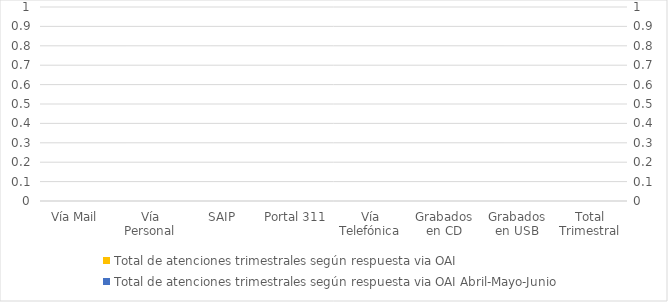
| Category | Total de atenciones trimestrales según respuesta via OAI | Series 2 | Series 4 |
|---|---|---|---|
| Vía Mail | 0 |  |  |
| Vía Personal | 0 |  |  |
| SAIP | 0 |  |  |
| Portal 311 | 0 |  |  |
| Vía Telefónica | 0 |  |  |
| Grabados en CD | 0 |  |  |
| Grabados en USB | 0 |  |  |
| Total Trimestral | 0 |  |  |